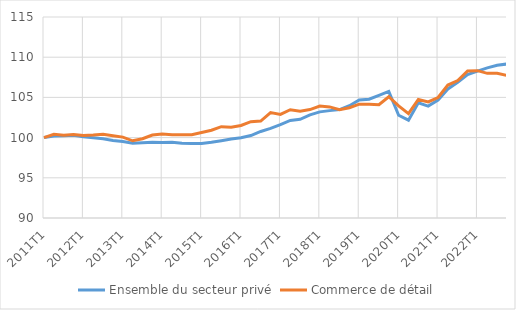
| Category | Ensemble du secteur privé | Commerce de détail |
|---|---|---|
| 2011T1 | 100 | 100 |
| 2011T2 | 100.21 | 100.422 |
| 2011T3 | 100.22 | 100.299 |
| 2011T4 | 100.279 | 100.371 |
| 2012T1 | 100.089 | 100.251 |
| 2012T2 | 99.985 | 100.312 |
| 2012T3 | 99.866 | 100.412 |
| 2012T4 | 99.651 | 100.242 |
| 2013T1 | 99.503 | 100.058 |
| 2013T2 | 99.306 | 99.604 |
| 2013T3 | 99.361 | 99.861 |
| 2013T4 | 99.409 | 100.326 |
| 2014T1 | 99.402 | 100.452 |
| 2014T2 | 99.432 | 100.353 |
| 2014T3 | 99.292 | 100.357 |
| 2014T4 | 99.267 | 100.363 |
| 2015T1 | 99.255 | 100.632 |
| 2015T2 | 99.412 | 100.912 |
| 2015T3 | 99.617 | 101.359 |
| 2015T4 | 99.835 | 101.284 |
| 2016T1 | 99.971 | 101.51 |
| 2016T2 | 100.257 | 101.984 |
| 2016T3 | 100.765 | 102.051 |
| 2016T4 | 101.15 | 103.117 |
| 2017T1 | 101.623 | 102.886 |
| 2017T2 | 102.135 | 103.472 |
| 2017T3 | 102.27 | 103.268 |
| 2017T4 | 102.833 | 103.489 |
| 2018T1 | 103.202 | 103.925 |
| 2018T2 | 103.355 | 103.816 |
| 2018T3 | 103.489 | 103.456 |
| 2018T4 | 103.968 | 103.72 |
| 2019T1 | 104.674 | 104.154 |
| 2019T2 | 104.776 | 104.139 |
| 2019T3 | 105.262 | 104.082 |
| 2019T4 | 105.744 | 105.083 |
| 2020T1 | 102.782 | 103.946 |
| 2020T2 | 102.168 | 102.975 |
| 2020T3 | 104.319 | 104.74 |
| 2020T4 | 103.913 | 104.434 |
| 2021T1 | 104.664 | 104.984 |
| 2021T2 | 106.046 | 106.536 |
| 2021T3 | 106.892 | 107.1 |
| 2021T4 | 107.842 | 108.297 |
| 2022T1 | 108.271 | 108.325 |
| 2022T2 | 108.673 | 107.989 |
| 2022T3 | 109.002 | 107.995 |
| 2022T4 | 109.153 | 107.733 |